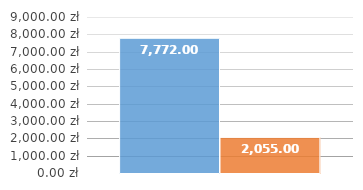
| Category | Series 0 | Series 1 |
|---|---|---|
| 0 | 7772 | 2055 |